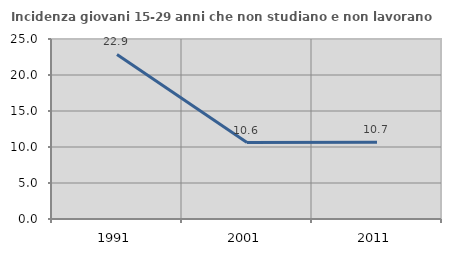
| Category | Incidenza giovani 15-29 anni che non studiano e non lavorano  |
|---|---|
| 1991.0 | 22.857 |
| 2001.0 | 10.625 |
| 2011.0 | 10.651 |